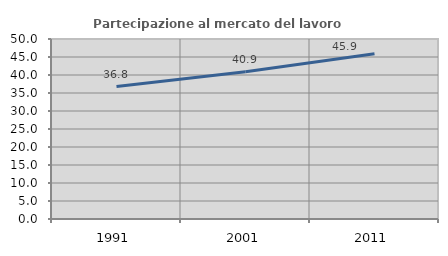
| Category | Partecipazione al mercato del lavoro  femminile |
|---|---|
| 1991.0 | 36.776 |
| 2001.0 | 40.909 |
| 2011.0 | 45.888 |